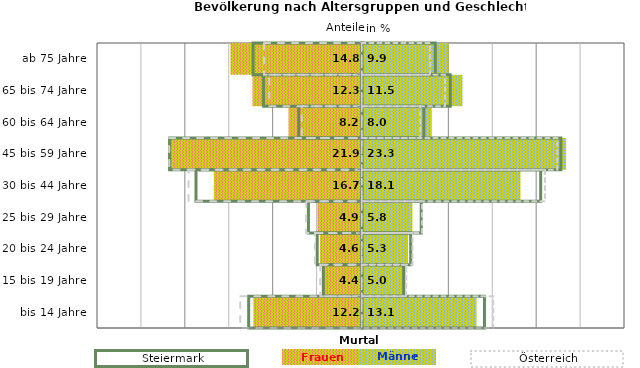
| Category | Frauen | Männer | Frauen Spalte2 | Männer Spalte2 | Frauen Spalte3 | Männer Spalte3 |
|---|---|---|---|---|---|---|
| bis 14 Jahre | -12.2 | 13.1 | 14 | -12.9 | -13.8 | 15 |
| 15 bis 19 Jahre | -4.4 | 5 | 4.8 | -4.4 | -4.7 | 5.1 |
| 20 bis 24 Jahre | -4.6 | 5.3 | 5.6 | -5.1 | -5.3 | 5.8 |
| 25 bis 29 Jahre | -4.9 | 5.8 | 6.8 | -6.1 | -6.3 | 6.9 |
| 30 bis 44 Jahre | -16.7 | 18.1 | 20.4 | -18.9 | -19.7 | 20.9 |
| 45 bis 59 Jahre | -21.9 | 23.3 | 22.7 | -21.9 | -21.9 | 22.3 |
| 60 bis 64 Jahre | -8.2 | 8 | 7.1 | -7.2 | -6.8 | 6.7 |
| 65 bis 74 Jahre | -12.3 | 11.5 | 10.1 | -11.2 | -10.5 | 9.5 |
| ab 75 Jahre | -14.8 | 9.9 | 8.4 | -12.4 | -11.1 | 7.8 |